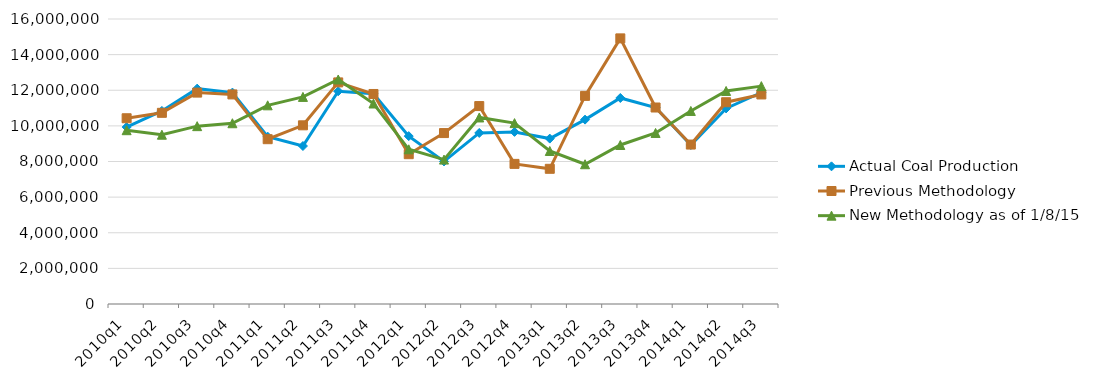
| Category | Actual Coal Production | Previous Methodology | New Methodology as of 1/8/15 |
|---|---|---|---|
| 2010q1 | 9932939 | 10427943 | 9757262 |
| 2010q2 | 10839808 | 10732887 | 9503789 |
| 2010q3 | 12090542 | 11868288 | 9984647 |
| 2010q4 | 11868876 | 11765660 | 10147405 |
| 2011q1 | 9393901 | 9252578 | 11153655 |
| 2011q2 | 8870156 | 10031296 | 11627057 |
| 2011q3 | 11944315 | 12441113 | 12603953 |
| 2011q4 | 11799866 | 11790576 | 11255461 |
| 2012q1 | 9426163 | 8410162 | 8685042 |
| 2012q2 | 8002699 | 9595834 | 8106986 |
| 2012q3 | 9603485 | 11111637 | 10472591 |
| 2012q4 | 9661635 | 7866234 | 10154936 |
| 2013q1 | 9285964 | 7590306 | 8590650 |
| 2013q2 | 10350412 | 11683827 | 7846082 |
| 2013q3 | 11566172 | 14911792 | 8927082 |
| 2013q4 | 11028935 | 11030887 | 9601871 |
| 2014q1 | 8927969 | 8951349 | 10837926 |
| 2014q2 | 10980554 | 11327892 | 11960296 |
| 2014q3 | 11873983 | 11763843 | 12231765 |